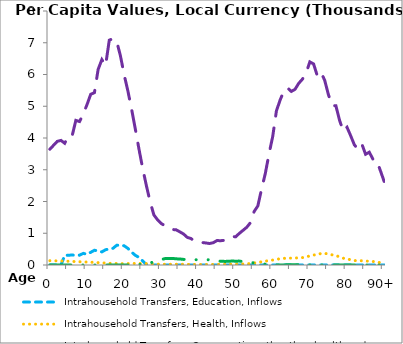
| Category | Intrahousehold Transfers, Education, Inflows | Intrahousehold Transfers, Health, Inflows | Intrahousehold Transfers, Consumption other than health and education, Inflows | Intrahousehold Transfers, Saving, Inflows |
|---|---|---|---|---|
| 0 | 0 | 135.55 | 3646.223 | 0 |
|  | 0 | 133.167 | 3770.828 | 0 |
| 2 | 0 | 130.784 | 3895.432 | 0 |
| 3 | 0 | 127.386 | 3924.129 | 0 |
| 4 | 303.509 | 123.397 | 3834.17 | 0 |
| 5 | 308.583 | 118.201 | 4070.178 | 0 |
| 6 | 313.658 | 112.6 | 4069.562 | 0 |
| 7 | 308.079 | 107.2 | 4554.631 | 0 |
| 8 | 309.676 | 102.198 | 4519.105 | 0 |
| 9 | 366.263 | 97 | 4758.31 | 0 |
| 10 | 337.08 | 92.801 | 5050.411 | 0 |
| 11 | 399.631 | 87.596 | 5376.331 | 0 |
| 12 | 464.063 | 81.793 | 5427.453 | 0 |
| 13 | 445.53 | 74.995 | 6161 | 0 |
| 14 | 412.916 | 67.802 | 6468.817 | 0 |
| 15 | 480.469 | 59.401 | 6281.399 | 0 |
| 16 | 505.335 | 52.8 | 7081.016 | 0 |
| 17 | 525.481 | 47.797 | 7129.931 | 0 |
| 18 | 621.355 | 45.793 | 7042.201 | 0 |
| 19 | 627.392 | 43.208 | 6588.834 | 0 |
| 20 | 605.338 | 42.41 | 5991.767 | 0 |
| 21 | 523.61 | 43.581 | 5485.919 | 0.84 |
| 22 | 405.346 | 46.752 | 4912.555 | 2.985 |
| 23 | 305.918 | 49.989 | 4287.947 | 4.205 |
| 24 | 239.779 | 49.865 | 3645.299 | 12.953 |
| 25 | 127.046 | 48.841 | 3038.038 | 23.567 |
| 26 | 14.313 | 45.199 | 2492.913 | 36.195 |
| 27 | 0 | 37.789 | 1989.76 | 65.591 |
| 28 | 0 | 29.601 | 1579.24 | 99.801 |
| 29 | 0 | 26.202 | 1422.262 | 140.606 |
| 30 | 0 | 23.402 | 1306.241 | 169.569 |
| 31 | 0 | 22.002 | 1234.828 | 201.789 |
| 32 | 0 | 22.602 | 1204.846 | 207.389 |
| 33 | 0 | 22.005 | 1117.791 | 208.204 |
| 34 | 0 | 23.796 | 1108.48 | 194.404 |
| 35 | 0 | 23.601 | 1044.344 | 189.556 |
| 36 | 0 | 23 | 975.746 | 176.604 |
| 37 | 0 | 20.204 | 870.073 | 170.404 |
| 38 | 0 | 19.199 | 832.968 | 166.602 |
| 39 | 0 | 16.401 | 746.628 | 161.803 |
| 40 | 0 | 15.798 | 721.972 | 171.145 |
| 41 | 0 | 15.6 | 708.414 | 173.425 |
| 42 | 0 | 15.01 | 694.161 | 170.091 |
| 43 | 0 | 15.003 | 676.858 | 160.65 |
| 44 | 0 | 17.007 | 702.73 | 154.021 |
| 45 | 0 | 21.411 | 769.411 | 135.023 |
| 46 | 0 | 21.378 | 765.667 | 117.779 |
| 47 | 0 | 22.148 | 778.082 | 113.815 |
| 48 | 0 | 24.597 | 837.775 | 114.448 |
| 49 | 0 | 27.201 | 903.185 | 125.208 |
| 50 | 0 | 24.988 | 886.758 | 120.176 |
| 51 | 0 | 29.192 | 994.873 | 122.949 |
| 52 | 0 | 33.403 | 1090.56 | 108.807 |
| 53 | 0 | 37.968 | 1187.61 | 99.857 |
| 54 | 0 | 45.942 | 1332 | 81.292 |
| 55 | 0 | 65.75 | 1684.454 | 65.147 |
| 56 | 0 | 76.457 | 1862.185 | 46.217 |
| 57 | 0 | 102.558 | 2393.156 | 40.07 |
| 58 | 0 | 121.337 | 2878.578 | 26.053 |
| 59 | 0 | 140.562 | 3495.473 | 9.566 |
| 60 | 0 | 155.044 | 4048.666 | 5.558 |
| 61 | 0 | 183.59 | 4855.238 | 4.037 |
| 62 | 0 | 193.874 | 5197.474 | 1.616 |
| 63 | 0 | 208.281 | 5480.383 | 0.604 |
| 64 | 0 | 217.962 | 5577.084 | 7.896 |
| 65 | 0 | 216.822 | 5467.361 | 10.022 |
| 66 | 0 | 219.333 | 5532.448 | 10.092 |
| 67 | 0 | 227.939 | 5721.168 | 9.45 |
| 68 | 0 | 232.646 | 5852.958 | 9.346 |
| 69 | 0 | 251.219 | 6047.442 | 1.98 |
| 70 | 0 | 288.886 | 6396.781 | 0 |
| 71 | 0 | 315.396 | 6333.167 | 0 |
| 72 | 0 | 323.199 | 5960.469 | 0.199 |
| 73 | 0 | 364.381 | 6075.338 | 0.2 |
| 74 | 0 | 365.835 | 5814.769 | 0.201 |
| 75 | 0 | 346.407 | 5364.015 | 0.201 |
| 76 | 0 | 319.01 | 5019.125 | 0.197 |
| 77 | 0 | 302.997 | 5017.657 | 0 |
| 78 | 0 | 250.749 | 4556.953 | 0 |
| 79 | 0 | 213.26 | 4214.617 | 0 |
| 80 | 0 | 191.427 | 4338.462 | 0 |
| 81 | 0 | 164.315 | 4068.807 | 0 |
| 82 | 0 | 140.786 | 3780.133 | 0 |
| 83 | 0 | 130.528 | 3649.902 | 0 |
| 84 | 0 | 134.667 | 3810.551 | 0 |
| 85 | 0 | 122.611 | 3488.061 | 0 |
| 86 | 0 | 121.684 | 3553.011 | 0 |
| 87 | 0 | 110.327 | 3328.989 | 0 |
| 88 | 0 | 96.946 | 3302.932 | 0 |
| 89 | 0 | 71.382 | 2967.452 | 0 |
| 90+ | 0 | 45.817 | 2631.972 | 0 |